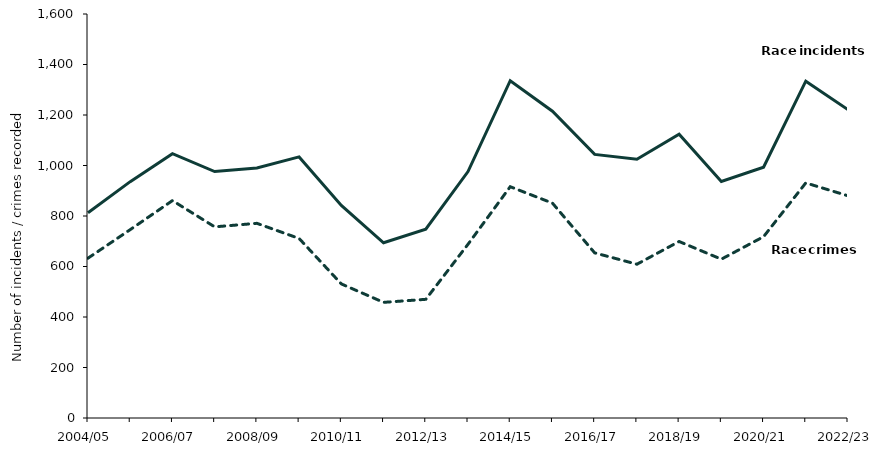
| Category | Race incidents | Race crimes |
|---|---|---|
| 2004/05 | 813 | 633 |
| 2005/06 | 936 | 746 |
| 2006/07 | 1047 | 861 |
| 2007/08 | 976 | 757 |
| 2008/09 | 990 | 771 |
| 2009/10 | 1034 | 711 |
| 2010/11 | 842 | 531 |
| 2011/12 | 694 | 458 |
| 2012/13 | 748 | 470 |
| 2013/14 | 976 | 688 |
| 2014/15 | 1336 | 916 |
| 2015/16 | 1215 | 851 |
| 2016/17 | 1044 | 654 |
| 2017/18 | 1025 | 609 |
| 2018/19 | 1124 | 699 |
| 2019/20 | 937 | 629 |
| 2020/21 | 993 | 718 |
| 2021/22 | 1334 | 931 |
| 2022/23 | 1221 | 880 |